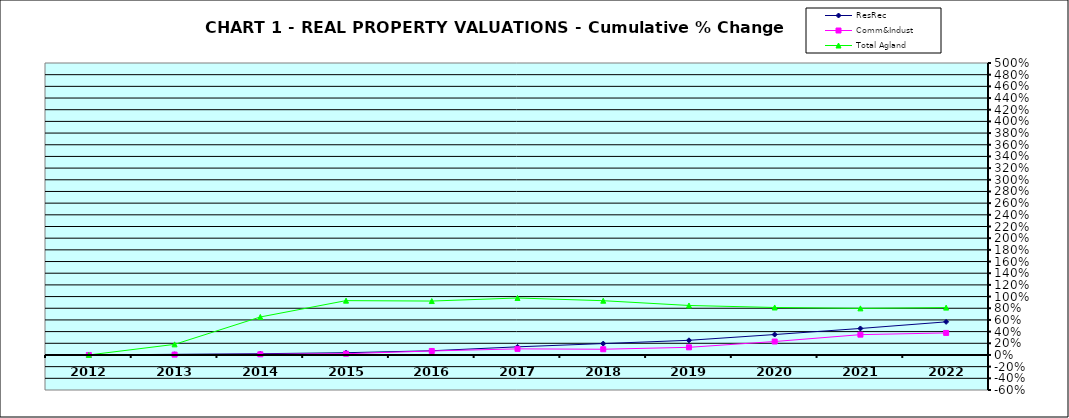
| Category | ResRec | Comm&Indust | Total Agland |
|---|---|---|---|
| 2012.0 | 0 | 0 | 0 |
| 2013.0 | 0.011 | 0.006 | 0.181 |
| 2014.0 | 0.022 | 0.011 | 0.65 |
| 2015.0 | 0.039 | 0.021 | 0.93 |
| 2016.0 | 0.072 | 0.069 | 0.923 |
| 2017.0 | 0.139 | 0.105 | 0.976 |
| 2018.0 | 0.195 | 0.098 | 0.929 |
| 2019.0 | 0.251 | 0.131 | 0.848 |
| 2020.0 | 0.35 | 0.23 | 0.813 |
| 2021.0 | 0.454 | 0.348 | 0.798 |
| 2022.0 | 0.567 | 0.377 | 0.811 |